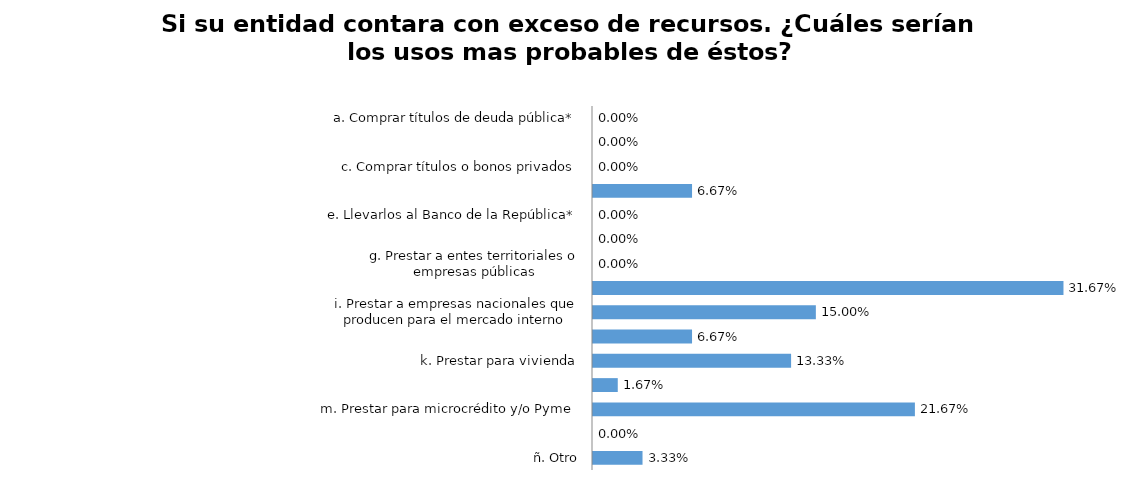
| Category | Series 0 |
|---|---|
| a. Comprar títulos de deuda pública* | 0 |
| b. Comprar títulos o bonos hipotecarios | 0 |
| c. Comprar títulos o bonos privados | 0 |
| d. Prestar a entidades financieras | 0.067 |
| e. Llevarlos al Banco de la República* | 0 |
| f. Prestar a empresas con inversión extranjera | 0 |
| g. Prestar a entes territoriales o empresas públicas | 0 |
| h. Prestar para consumo | 0.317 |
| i. Prestar a empresas nacionales que producen para el mercado interno | 0.15 |
| j. Prestar a constructores | 0.067 |
| k. Prestar para vivienda | 0.133 |
| l. Prestar a empresas nacionales que producen en una alta proporción para el mercado externo | 0.017 |
| m. Prestar para microcrédito y/o Pyme | 0.217 |
| n. Aumentar la posición propia en moneda extranjera | 0 |
| ñ. Otro | 0.033 |